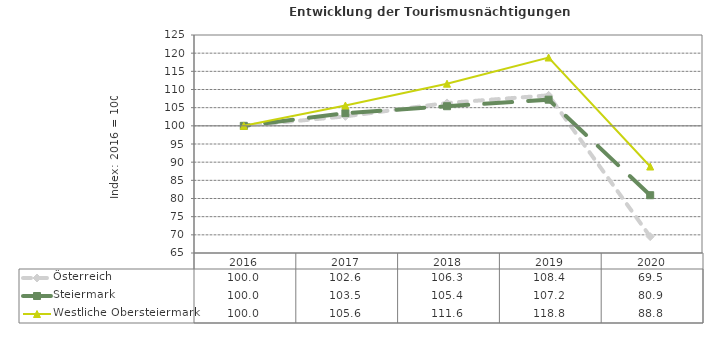
| Category | Österreich | Steiermark | Westliche Obersteiermark |
|---|---|---|---|
| 2020.0 | 69.5 | 80.9 | 88.8 |
| 2019.0 | 108.4 | 107.2 | 118.8 |
| 2018.0 | 106.3 | 105.4 | 111.6 |
| 2017.0 | 102.6 | 103.5 | 105.6 |
| 2016.0 | 100 | 100 | 100 |